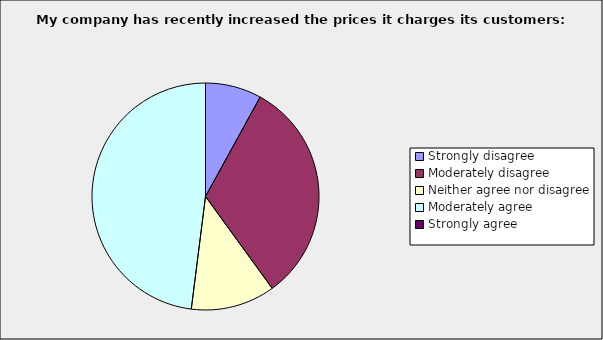
| Category | Series 0 |
|---|---|
| Strongly disagree | 0.08 |
| Moderately disagree | 0.32 |
| Neither agree nor disagree | 0.12 |
| Moderately agree | 0.48 |
| Strongly agree | 0 |